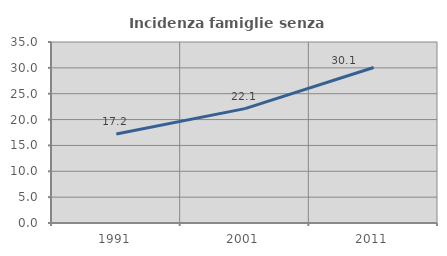
| Category | Incidenza famiglie senza nuclei |
|---|---|
| 1991.0 | 17.212 |
| 2001.0 | 22.118 |
| 2011.0 | 30.066 |